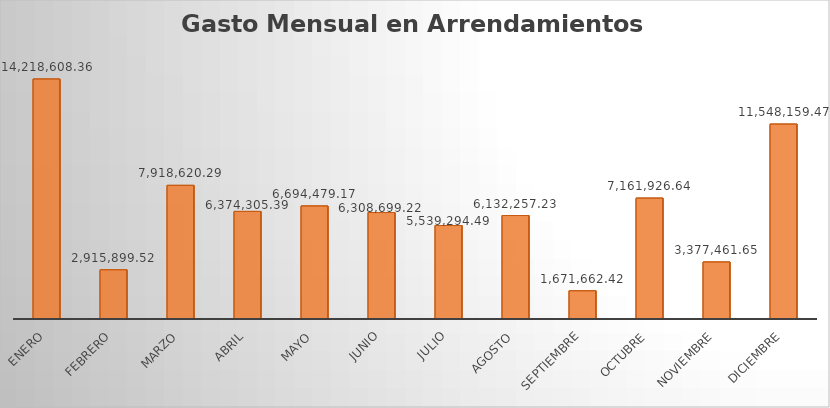
| Category | Monto |
|---|---|
| ENERO | 14218608.36 |
| FEBRERO | 2915899.52 |
| MARZO | 7918620.29 |
| ABRIL | 6374305.39 |
| MAYO | 6694479.17 |
| JUNIO | 6308699.22 |
| JULIO | 5539294.49 |
| AGOSTO | 6132257.23 |
| SEPTIEMBRE | 1671662.42 |
| OCTUBRE | 7161926.64 |
| NOVIEMBRE | 3377461.65 |
| DICIEMBRE | 11548159.47 |